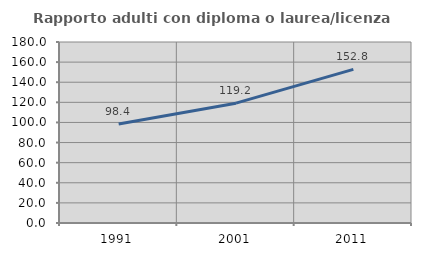
| Category | Rapporto adulti con diploma o laurea/licenza media  |
|---|---|
| 1991.0 | 98.449 |
| 2001.0 | 119.163 |
| 2011.0 | 152.777 |